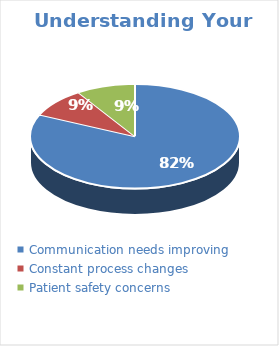
| Category | Series 0 |
|---|---|
| Communication needs improving | 0.818 |
| Constant process changes | 0.091 |
| Patient safety concerns | 0.091 |